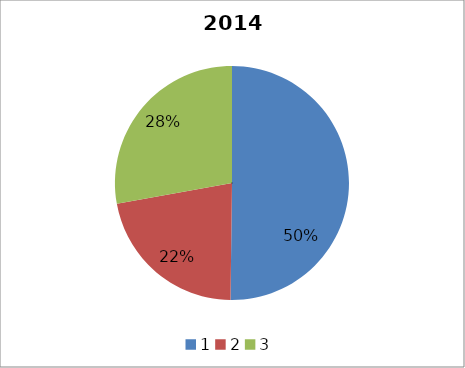
| Category | 2014 Breakdown |
|---|---|
| 0 | 0.502 |
| 1 | 0.22 |
| 2 | 0.278 |